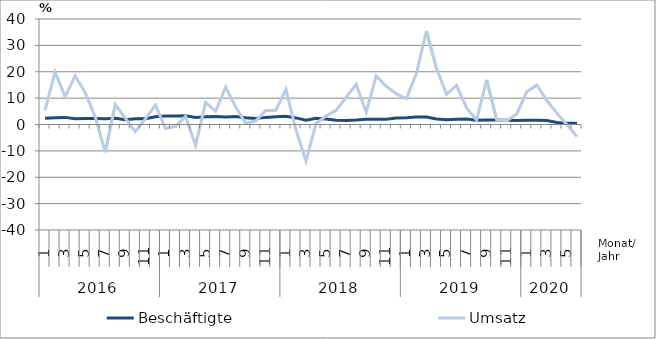
| Category | Beschäftigte | Umsatz |
|---|---|---|
| 0 | 2.4 | 5.4 |
| 1 | 2.6 | 19.9 |
| 2 | 2.7 | 10.5 |
| 3 | 2.2 | 18.4 |
| 4 | 2.3 | 12.1 |
| 5 | 2.3 | 2.9 |
| 6 | 2.2 | -10.5 |
| 7 | 2.4 | 7.6 |
| 8 | 1.8 | 2.4 |
| 9 | 2.2 | -2.7 |
| 10 | 2.2 | 2.1 |
| 11 | 2.9 | 7.4 |
| 12 | 3.2 | -1.5 |
| 13 | 3.2 | -0.7 |
| 14 | 3.3 | 3.1 |
| 15 | 2.7 | -7.9 |
| 16 | 2.9 | 8.4 |
| 17 | 3 | 5 |
| 18 | 2.8 | 14.2 |
| 19 | 3 | 6.6 |
| 20 | 2.6 | 0.4 |
| 21 | 2.3 | 1.4 |
| 22 | 2.7 | 5.3 |
| 23 | 2.9 | 5.4 |
| 24 | 3.1 | 13.3 |
| 25 | 2.5 | -2 |
| 26 | 1.6 | -13.9 |
| 27 | 2.4 | 0.4 |
| 28 | 2.1 | 3.2 |
| 29 | 1.6 | 5.4 |
| 30 | 1.5 | 10.3 |
| 31 | 1.7 | 15.2 |
| 32 | 2 | 4.7 |
| 33 | 2 | 18.4 |
| 34 | 2 | 14.5 |
| 35 | 2.5 | 11.6 |
| 36 | 2.6 | 9.8 |
| 37 | 2.8 | 19.4 |
| 38 | 2.8 | 35.4 |
| 39 | 2.1 | 21.3 |
| 40 | 1.8 | 11.5 |
| 41 | 2 | 14.8 |
| 42 | 2.1 | 6.3 |
| 43 | 1.6 | 1.7 |
| 44 | 1.7 | 16.9 |
| 45 | 1.7 | 1.8 |
| 46 | 1.6 | 1.4 |
| 47 | 1.5 | 4 |
| 48 | 1.6 | 12.4 |
| 49 | 1.6 | 14.9 |
| 50 | 1.5 | 9.1 |
| 51 | 0.8 | 4.3 |
| 52 | 0.5 | -0.1 |
| 53 | 0.5 | -4.6 |